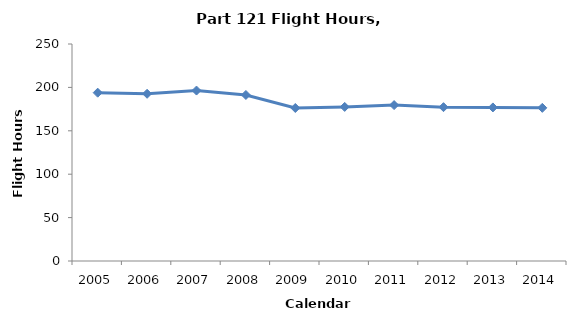
| Category | Flight Hours (100,000s) |
|---|---|
| 2005.0 | 193.9 |
| 2006.0 | 192.632 |
| 2007.0 | 196.373 |
| 2008.0 | 191.268 |
| 2009.0 | 176.268 |
| 2010.0 | 177.51 |
| 2011.0 | 179.63 |
| 2012.0 | 177.222 |
| 2013.0 | 176.927 |
| 2014.0 | 176.461 |